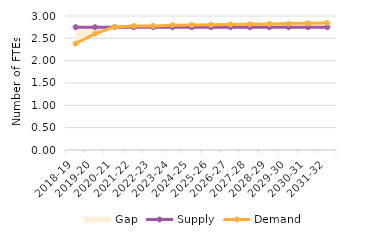
| Category | Supply | Demand |
|---|---|---|
| 2018-19 | 2.75 | 2.38 |
| 2019-20 | 2.75 | 2.603 |
| 2020-21 | 2.75 | 2.756 |
| 2021-22 | 2.75 | 2.778 |
| 2022-23 | 2.75 | 2.779 |
| 2023-24 | 2.75 | 2.795 |
| 2024-25 | 2.75 | 2.8 |
| 2025-26 | 2.75 | 2.805 |
| 2026-27 | 2.75 | 2.811 |
| 2027-28 | 2.75 | 2.817 |
| 2028-29 | 2.75 | 2.823 |
| 2029-30 | 2.75 | 2.83 |
| 2030-31 | 2.75 | 2.837 |
| 2031-32 | 2.75 | 2.844 |